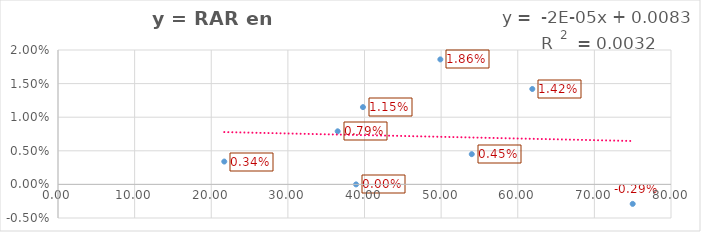
| Category | y = RAR en IAM |
|---|---|
| 38.9 | 0 |
| 39.8 | 0.012 |
| 54.0 | 0.004 |
| 61.9 | 0.014 |
| 21.7 | 0.003 |
| 75.0 | -0.003 |
| 36.5 | 0.008 |
| 49.9 | 0.019 |